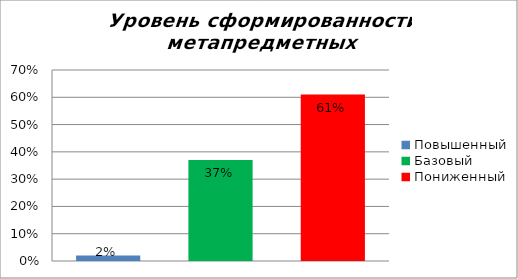
| Category | Уровень сформированности метапредметных результатов |
|---|---|
| Повышенный | 0.02 |
| Базовый | 0.37 |
| Пониженный | 0.61 |